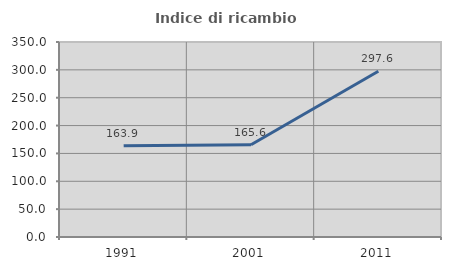
| Category | Indice di ricambio occupazionale  |
|---|---|
| 1991.0 | 163.889 |
| 2001.0 | 165.625 |
| 2011.0 | 297.619 |